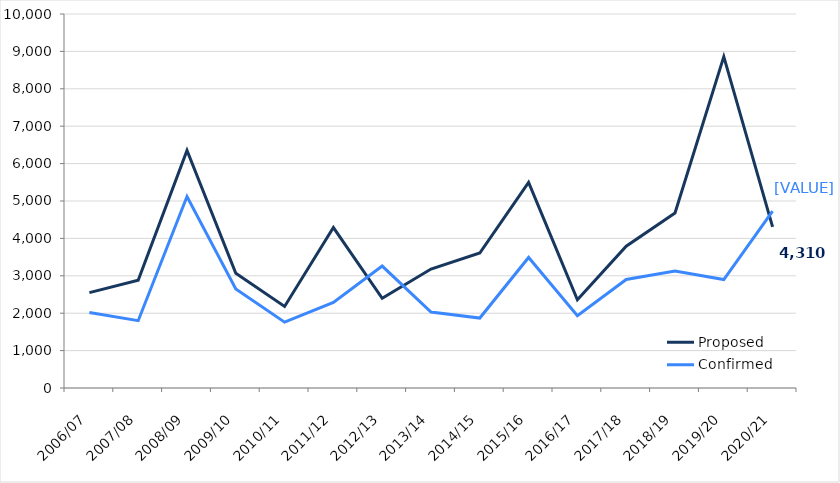
| Category | Proposed | Confirmed |
|---|---|---|
| 2006/07 | 2550 | 2020 |
| 2007/08 | 2880 | 1800 |
| 2008/09 | 6350 | 5120 |
| 2009/10 | 3070 | 2650 |
| 2010/11 | 2180 | 1760 |
| 2011/12 | 4290 | 2290 |
| 2012/13 | 2400 | 3260 |
| 2013/14 | 3180 | 2030 |
| 2014/15 | 3610 | 1870 |
| 2015/16 | 5500 | 3490 |
| 2016/17 | 2360 | 1930 |
| 2017/18 | 3790 | 2900 |
| 2018/19 | 4680 | 3130 |
| 2019/20 | 8860 | 2900 |
| 2020/21 | 4310 | 4730 |